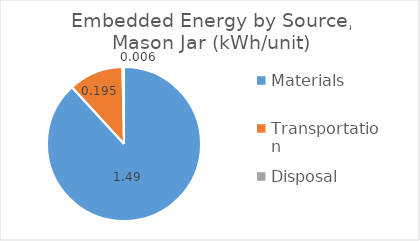
| Category | Series 0 |
|---|---|
| Materials | 1.495 |
| Transportation | 0.195 |
| Disposal | 0.006 |